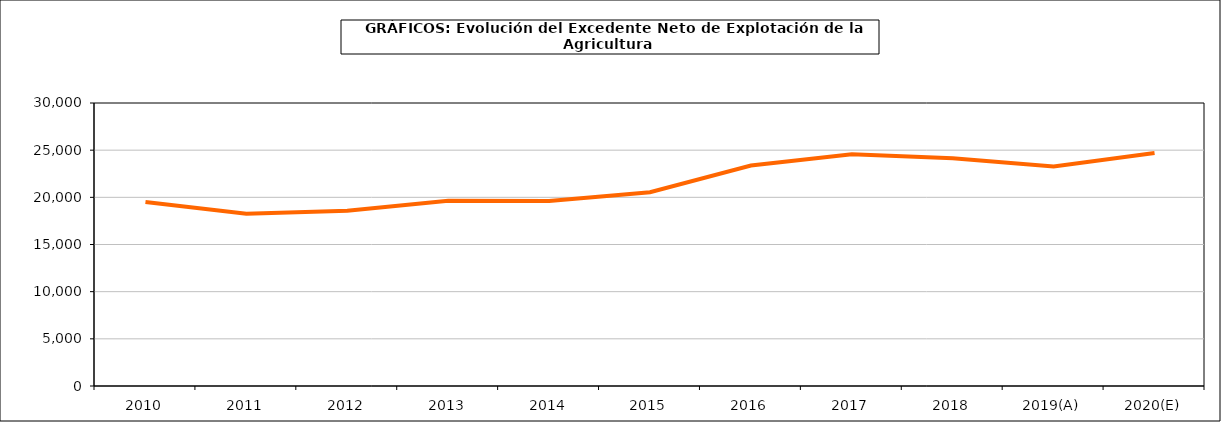
| Category | excedente neto de explotacion |
|---|---|
| 2010 | 19508.768 |
| 2011 | 18252.686 |
| 2012 | 18589.082 |
| 2013 | 19635.617 |
| 2014 | 19616.041 |
| 2015 | 20539.815 |
| 2016 | 23367.672 |
| 2017 | 24560.03 |
| 2018 | 24137.083 |
| 2019(A) | 23262.333 |
| 2020(E) | 24706.426 |